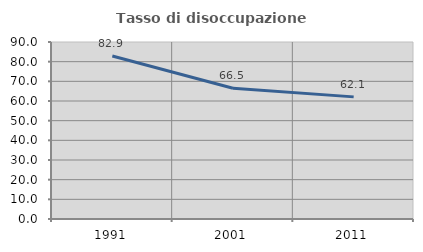
| Category | Tasso di disoccupazione giovanile  |
|---|---|
| 1991.0 | 82.873 |
| 2001.0 | 66.452 |
| 2011.0 | 62.097 |